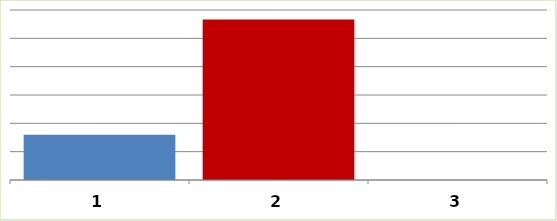
| Category | Series 0 |
|---|---|
| 0 | 15949627 |
| 1 | 56654402 |
| 2 | 0 |